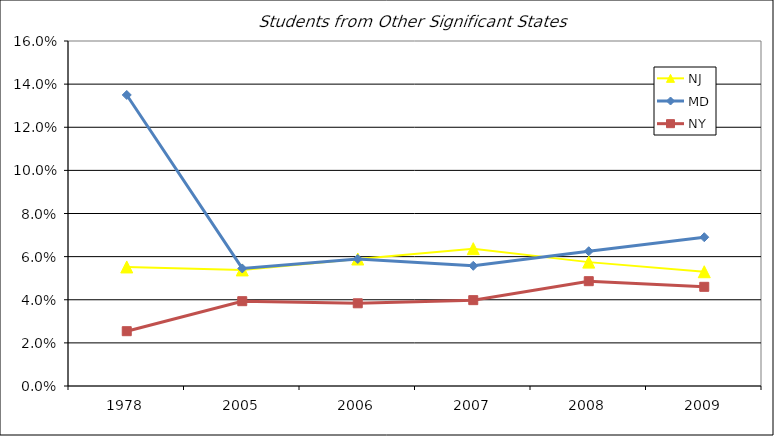
| Category | NJ | MD | NY |
|---|---|---|---|
| 1978.0 | 0.055 | 0.135 | 0.025 |
| 2005.0 | 0.054 | 0.055 | 0.039 |
| 2006.0 | 0.059 | 0.059 | 0.038 |
| 2007.0 | 0.064 | 0.056 | 0.04 |
| 2008.0 | 0.057 | 0.062 | 0.049 |
| 2009.0 | 0.053 | 0.069 | 0.046 |